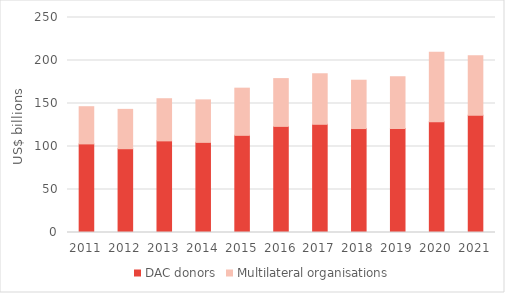
| Category | DAC donors | Multilateral organisations |
|---|---|---|
| 2011.0 | 103.027 | 43.239 |
| 2012.0 | 97.425 | 45.751 |
| 2013.0 | 106.544 | 49.004 |
| 2014.0 | 104.808 | 49.4 |
| 2015.0 | 112.985 | 54.837 |
| 2016.0 | 123.396 | 55.558 |
| 2017.0 | 125.821 | 58.752 |
| 2018.0 | 120.869 | 56.192 |
| 2019.0 | 120.982 | 60.022 |
| 2020.0 | 128.893 | 80.75 |
| 2021.0 | 136.41 | 69.156 |